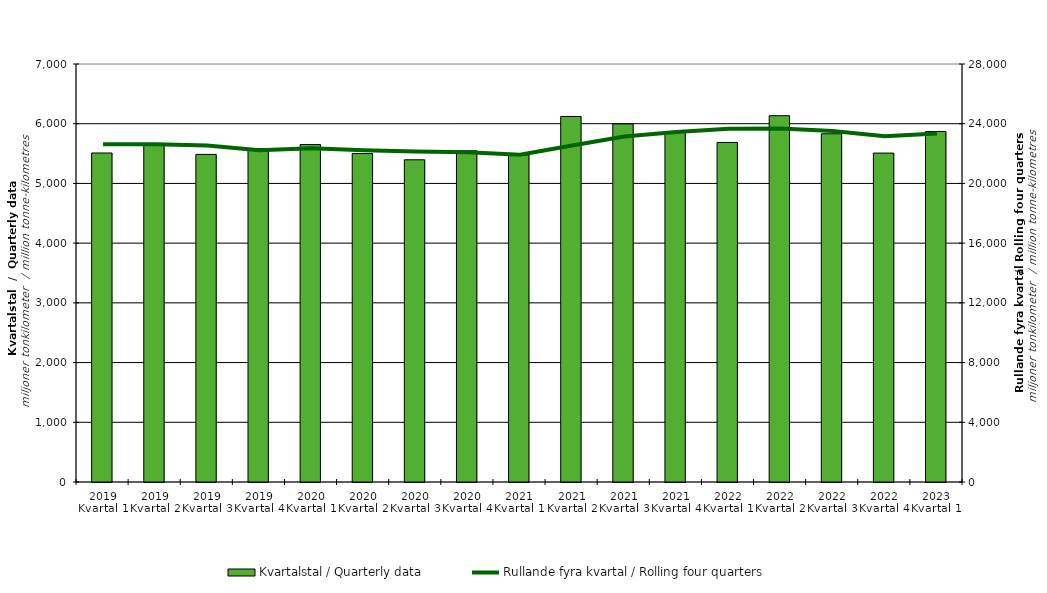
| Category | Kvartalstal / Quarterly data |
|---|---|
| 2019 Kvartal 1 | 5509.773 |
| 2019 Kvartal 2 | 5641.612 |
| 2019 Kvartal 3 | 5486.395 |
| 2019 Kvartal 4 | 5584.286 |
| 2020 Kvartal 1 | 5650.915 |
| 2020 Kvartal 2 | 5500.334 |
| 2020 Kvartal 3 | 5395.987 |
| 2020 Kvartal 4 | 5546.662 |
| 2021 Kvartal 1 | 5476.427 |
| 2021 Kvartal 2 | 6121.807 |
| 2021 Kvartal 3 | 5996.688 |
| 2021 Kvartal 4 | 5853.966 |
| 2022 Kvartal 1 | 5686.696 |
| 2022 Kvartal 2 | 6134.1 |
| 2022 Kvartal 3 | 5831.909 |
| 2022 Kvartal 4 | 5508.231 |
| 2023 Kvartal 1 | 5870.368 |